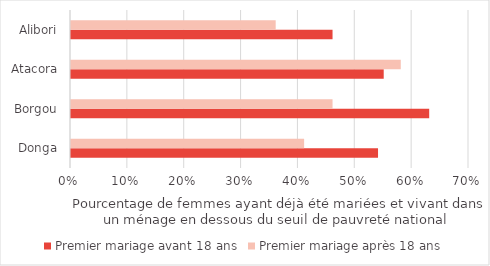
| Category | Premier mariage avant 18 ans | Premier mariage après 18 ans |
|---|---|---|
| Donga | 0.54 | 0.41 |
| Borgou | 0.63 | 0.46 |
| Atacora | 0.55 | 0.58 |
| Alibori | 0.46 | 0.36 |